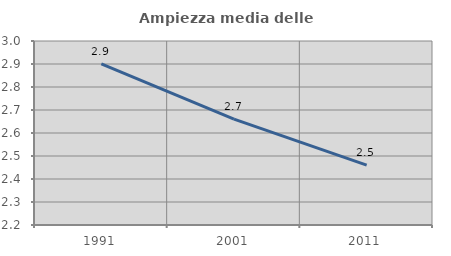
| Category | Ampiezza media delle famiglie |
|---|---|
| 1991.0 | 2.901 |
| 2001.0 | 2.66 |
| 2011.0 | 2.46 |